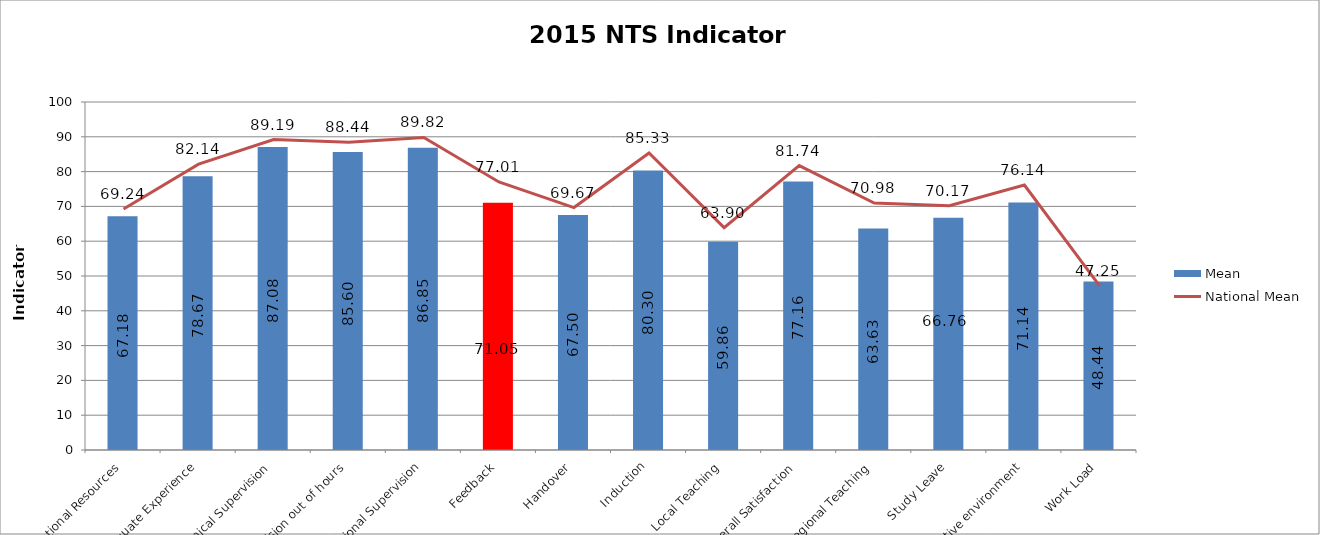
| Category | Mean |
|---|---|
| Access to Educational Resources | 67.18 |
| Adequate Experience | 78.67 |
| Clinical Supervision | 87.08 |
| Clinical Supervision out of hours | 85.6 |
| Educational Supervision | 86.85 |
| Feedback | 71.05 |
| Handover | 67.5 |
| Induction | 80.3 |
| Local Teaching | 59.86 |
| Overall Satisfaction | 77.16 |
| Regional Teaching | 63.63 |
| Study Leave | 66.76 |
| Supportive environment | 71.14 |
| Work Load | 48.44 |